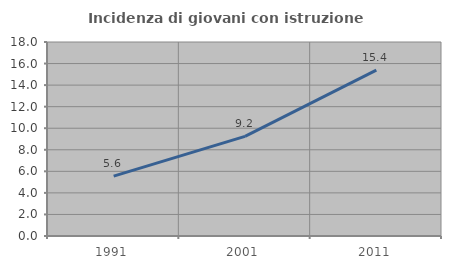
| Category | Incidenza di giovani con istruzione universitaria |
|---|---|
| 1991.0 | 5.556 |
| 2001.0 | 9.244 |
| 2011.0 | 15.385 |